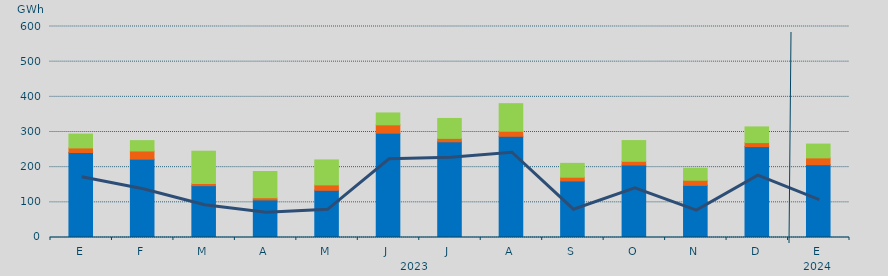
| Category | Asignación SEPE | Asignación Francia | Asignación Portugal |
|---|---|---|---|
| E | 241649.025 | 13030.5 | 39359.9 |
| F | 222841.2 | 23234.4 | 29375.8 |
| M | 147441.275 | 6126.3 | 91808.3 |
| A | 106835.5 | 6210.9 | 74632.6 |
| M | 134157.925 | 15418.6 | 70990 |
| J | 296773.85 | 23610.9 | 33804.6 |
| J | 272106 | 9754 | 56632.6 |
| A | 287813.1 | 14419.4 | 78281 |
| S | 160873.1 | 10544 | 39388.9 |
| O | 206141.775 | 10508.8 | 58942.5 |
| N | 148282.275 | 14554.1 | 34048.3 |
| D | 258424.925 | 11374.3 | 44685.4 |
| E | 207079.95 | 19280.5 | 39323.5 |